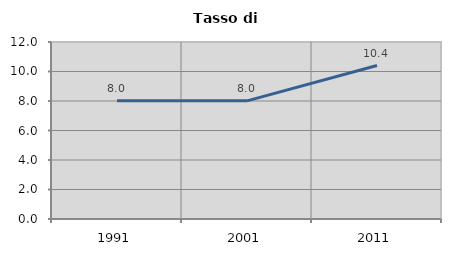
| Category | Tasso di disoccupazione   |
|---|---|
| 1991.0 | 8.011 |
| 2001.0 | 8.011 |
| 2011.0 | 10.405 |